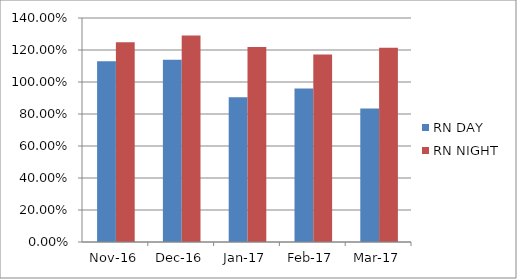
| Category | RN DAY | RN NIGHT |
|---|---|---|
| 2016-11-01 | 1.13 | 1.248 |
| 2016-12-01 | 1.139 | 1.29 |
| 2017-01-01 | 0.905 | 1.218 |
| 2017-02-01 | 0.96 | 1.173 |
| 2017-03-01 | 0.834 | 1.214 |